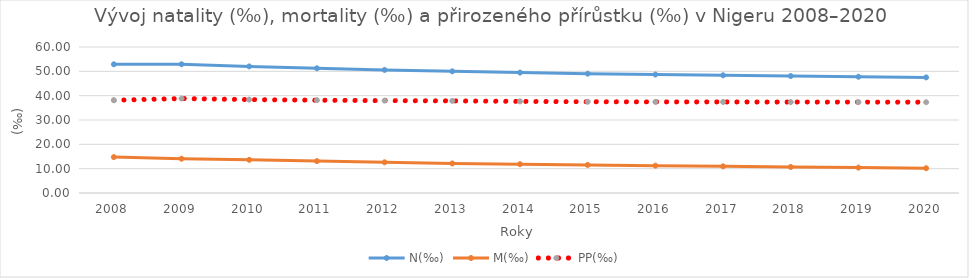
| Category | N(‰) | M(‰) | PP(‰) |
|---|---|---|---|
| 2008.0 | 52.89 | 14.76 | 38.13 |
| 2009.0 | 52.9 | 14.09 | 38.81 |
| 2010.0 | 52.02 | 13.63 | 38.39 |
| 2011.0 | 51.24 | 13.1 | 38.14 |
| 2012.0 | 50.58 | 12.61 | 37.97 |
| 2013.0 | 50 | 12.14 | 37.86 |
| 2014.0 | 49.48 | 11.83 | 37.65 |
| 2015.0 | 49.04 | 11.53 | 37.51 |
| 2016.0 | 48.68 | 11.24 | 37.44 |
| 2017.0 | 48.37 | 10.96 | 37.41 |
| 2018.0 | 48.06 | 10.69 | 37.37 |
| 2019.0 | 47.78 | 10.44 | 37.34 |
| 2020.0 | 47.51 | 10.19 | 37.32 |